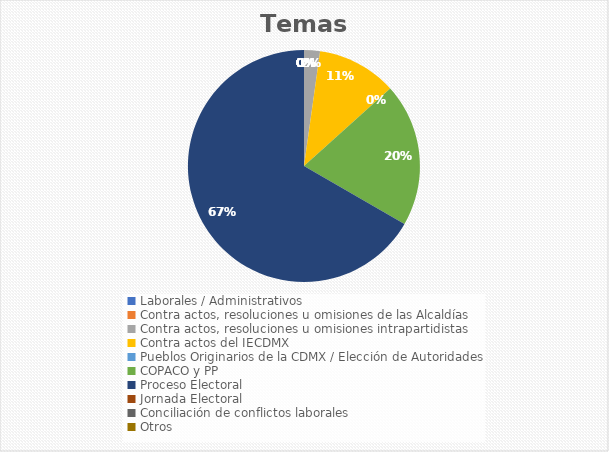
| Category | Temas |
|---|---|
| Laborales / Administrativos | 0 |
| Contra actos, resoluciones u omisiones de las Alcaldías | 0 |
| Contra actos, resoluciones u omisiones intrapartidistas | 1 |
| Contra actos del IECDMX | 5 |
| Pueblos Originarios de la CDMX / Elección de Autoridades | 0 |
| COPACO y PP | 9 |
| Proceso Electoral | 30 |
| Jornada Electoral | 0 |
| Conciliación de conflictos laborales | 0 |
| Otros | 0 |